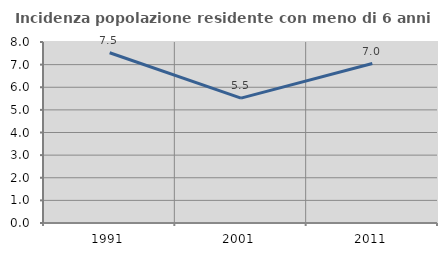
| Category | Incidenza popolazione residente con meno di 6 anni |
|---|---|
| 1991.0 | 7.524 |
| 2001.0 | 5.519 |
| 2011.0 | 7.047 |